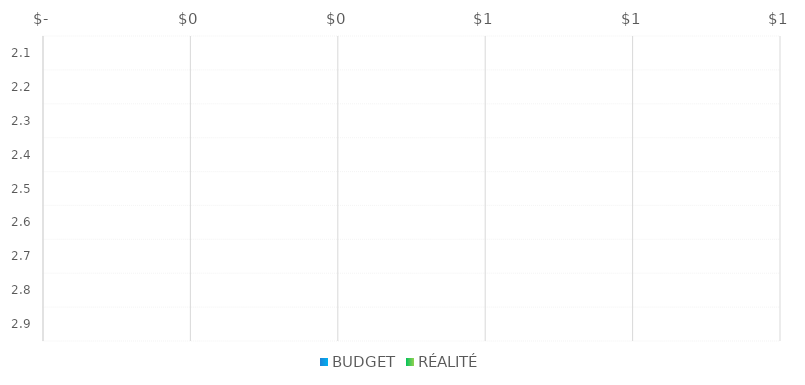
| Category | BUDGET | RÉALITÉ |
|---|---|---|
| 2.1 |  | 0 |
| 2.2 |  | 0 |
| 2.3 |  | 0 |
| 2.4 |  | 0 |
| 2.5 |  | 0 |
| 2.6 |  | 0 |
| 2.7 |  | 0 |
| 2.8 |  | 0 |
| 2.9 |  | 0 |